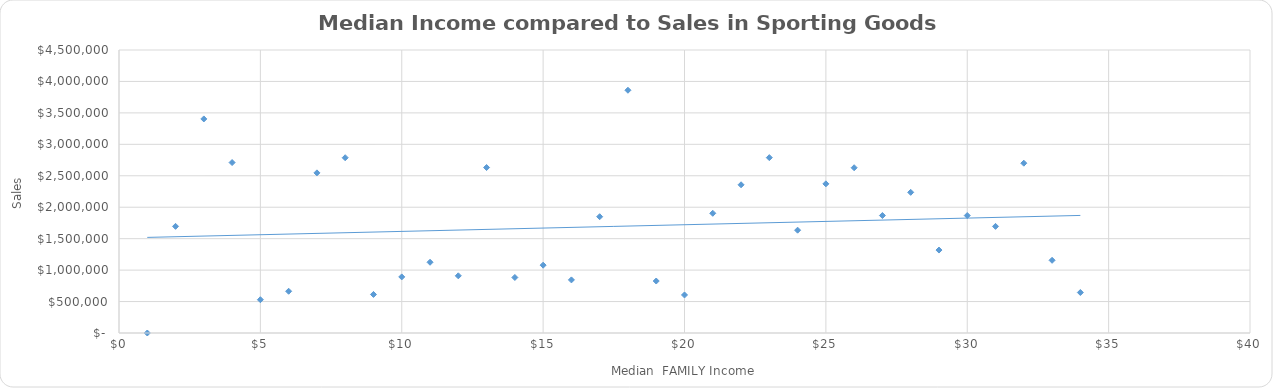
| Category | Income |
|---|---|
| 0 | 0 |
| 1 | 1695712.62 |
| 2 | 3403862.053 |
| 3 | 2710352.905 |
| 4 | 529215.459 |
| 5 | 663686.654 |
| 6 | 2546324.335 |
| 7 | 2787046.202 |
| 8 | 612696.054 |
| 9 | 891822.033 |
| 10 | 1124967.965 |
| 11 | 909500.976 |
| 12 | 2631166.881 |
| 13 | 882972.654 |
| 14 | 1078573.124 |
| 15 | 844320.194 |
| 16 | 1849119.029 |
| 17 | 3860007.316 |
| 18 | 826573.88 |
| 19 | 604682.868 |
| 20 | 1903611.6 |
| 21 | 2356808.391 |
| 22 | 2788571.957 |
| 23 | 1634878.286 |
| 24 | 2371627.369 |
| 25 | 2627837.961 |
| 26 | 1868116.33 |
| 27 | 2236796.862 |
| 28 | 1318876.234 |
| 29 | 1868097.836 |
| 30 | 1695218.566 |
| 31 | 2700194.415 |
| 32 | 1156049.774 |
| 33 | 643858.444 |